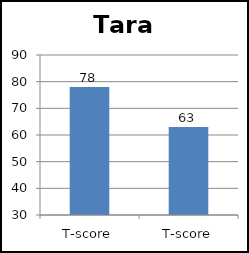
| Category | Tara |
|---|---|
| T-score | 78 |
| T-score | 63 |